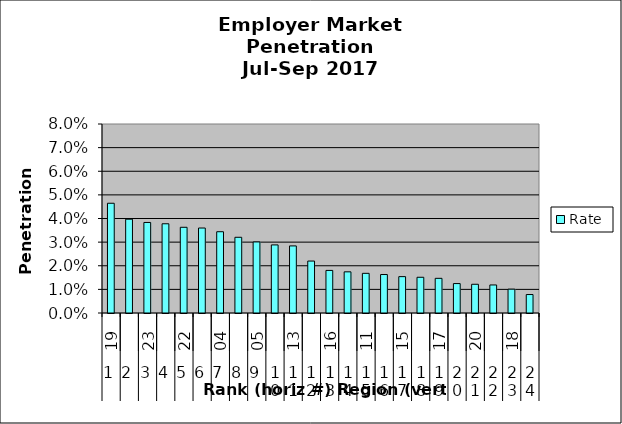
| Category | Rate |
|---|---|
| 0 | 0.046 |
| 1 | 0.04 |
| 2 | 0.038 |
| 3 | 0.038 |
| 4 | 0.036 |
| 5 | 0.036 |
| 6 | 0.034 |
| 7 | 0.032 |
| 8 | 0.03 |
| 9 | 0.029 |
| 10 | 0.028 |
| 11 | 0.022 |
| 12 | 0.018 |
| 13 | 0.017 |
| 14 | 0.017 |
| 15 | 0.016 |
| 16 | 0.015 |
| 17 | 0.015 |
| 18 | 0.015 |
| 19 | 0.012 |
| 20 | 0.012 |
| 21 | 0.012 |
| 22 | 0.01 |
| 23 | 0.008 |